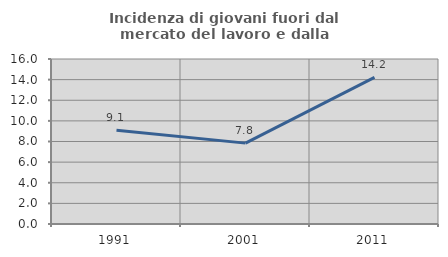
| Category | Incidenza di giovani fuori dal mercato del lavoro e dalla formazione  |
|---|---|
| 1991.0 | 9.091 |
| 2001.0 | 7.843 |
| 2011.0 | 14.226 |